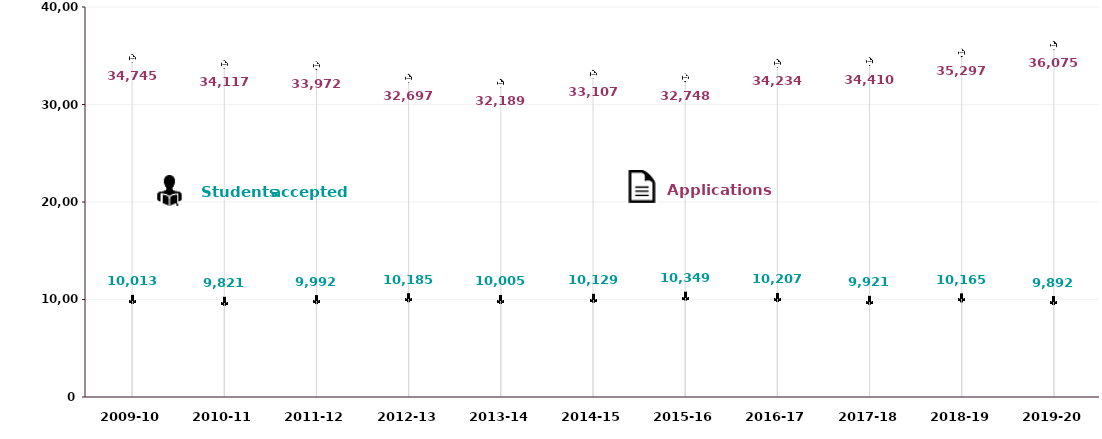
| Category | Applications | Students Accepted |
|---|---|---|
| 2009-10 | 34745 | 10013 |
| 2010-11 | 34117 | 9821 |
| 2011-12 | 33972 | 9992 |
| 2012-13 | 32697 | 10185 |
| 2013-14 | 32189 | 10005 |
| 2014-15 | 33107 | 10129 |
| 2015-16 | 32748 | 10349 |
| 2016-17 | 34234 | 10207 |
| 2017-18 | 34410 | 9921 |
| 2018-19 | 35297 | 10165 |
| 2019-20 | 36075 | 9892 |